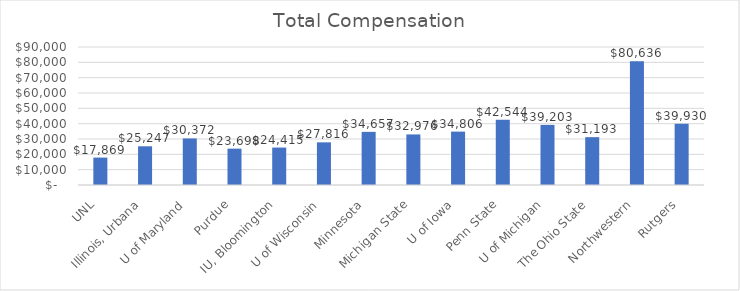
| Category | Series 0 |
|---|---|
|  UNL  | 17869.183 |
|  Illinois, Urbana  | 25246.84 |
|  U of Maryland  | 30372.2 |
|  Purdue  | 23697.8 |
|  IU, Bloomington  | 24414.84 |
|  U of Wisconsin  | 27816.48 |
|  Minnesota  | 34657.182 |
|  Michigan State  | 32976 |
|  U of Iowa  | 34806.2 |
|  Penn State  | 42544 |
|  U of Michigan  | 39202.81 |
|  The Ohio State  | 31192.8 |
|  Northwestern  | 80636 |
|  Rutgers  | 39930 |